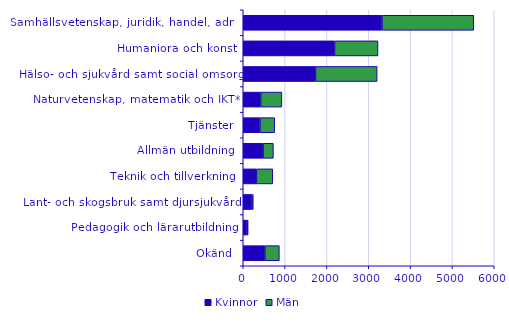
| Category | Kvinnor | Män |
|---|---|---|
| Okänd | 516 | 347 |
| Pedagogik och lärarutbildning | 92 | 25 |
| Lant- och skogsbruk samt djursjukvård | 206 | 34 |
| Teknik och tillverkning | 314 | 391 |
| Allmän utbildning | 475 | 246 |
| Tjänster | 399 | 353 |
| Naturvetenskap, matematik och IKT* | 416 | 507 |
| Hälso- och sjukvård samt social omsorg | 1726 | 1475 |
| Humaniora och konst | 2182 | 1039 |
| Samhällsvetenskap, juridik, handel, adm. | 3315 | 2195 |